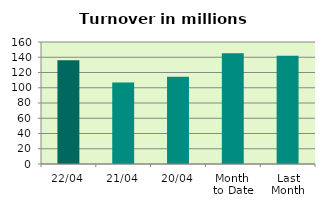
| Category | Series 0 |
|---|---|
| 22/04 | 136.161 |
| 21/04 | 106.9 |
| 20/04 | 114.542 |
| Month 
to Date | 145.258 |
| Last
Month | 142.086 |